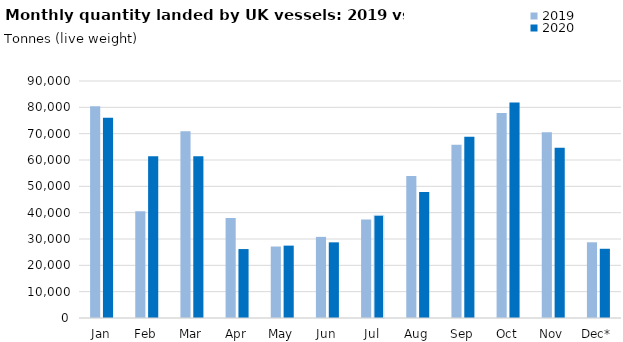
| Category | 2019 | 2020 |
|---|---|---|
| Jan | 80449.291 | 76070.432 |
| Feb | 40561.665 | 61399.204 |
| Mar | 70939.218 | 61380.871 |
| Apr | 38003.491 | 26179.611 |
| May | 27139.703 | 27483.935 |
| Jun | 30804.211 | 28731.815 |
| Jul | 37398.356 | 39055.339 |
| Aug | 53963.042 | 47858.504 |
| Sep | 65751.581 | 68791.776 |
| Oct | 77865.008 | 81860.858 |
| Nov | 70510.226 | 64626.397 |
| Dec* | 28755.971 | 26289.45 |